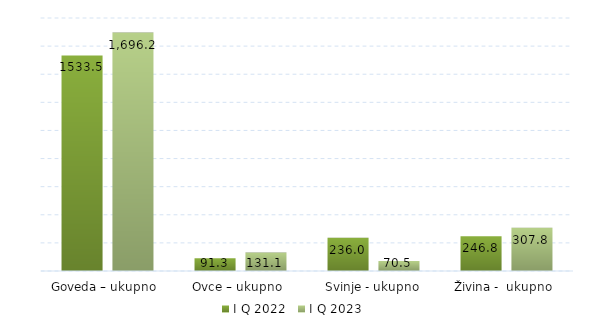
| Category | I Q 2022 | I Q 2023 |
|---|---|---|
| Goveda – ukupno  | 1533.5 | 1696.2 |
| Ovce – ukupno  | 91.3 | 131.1 |
| Svinje - ukupno | 236 | 70.5 |
| Živina -  ukupno  | 246.8 | 307.8 |